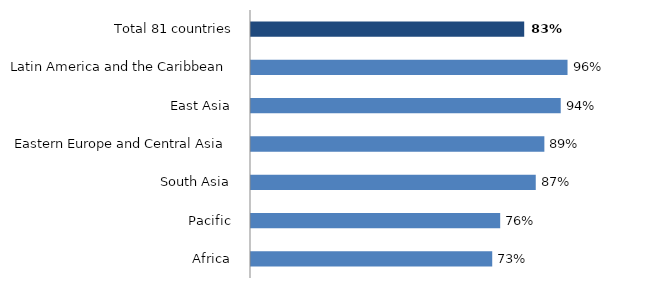
| Category | Series 0 |
|---|---|
| Total 81 countries | 0.83 |
| Latin America and the Caribbean  | 0.962 |
| East Asia  | 0.941 |
| Eastern Europe and Central Asia  | 0.891 |
| South Asia  | 0.865 |
| Pacific  | 0.757 |
| Africa  | 0.733 |